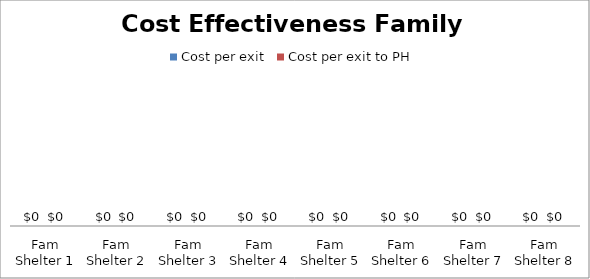
| Category | Cost per exit | Cost per exit to PH |
|---|---|---|
| Fam Shelter 1 | 0 | 0 |
| Fam Shelter 2 | 0 | 0 |
| Fam Shelter 3 | 0 | 0 |
| Fam Shelter 4 | 0 | 0 |
| Fam Shelter 5 | 0 | 0 |
| Fam Shelter 6 | 0 | 0 |
| Fam Shelter 7 | 0 | 0 |
| Fam Shelter 8 | 0 | 0 |